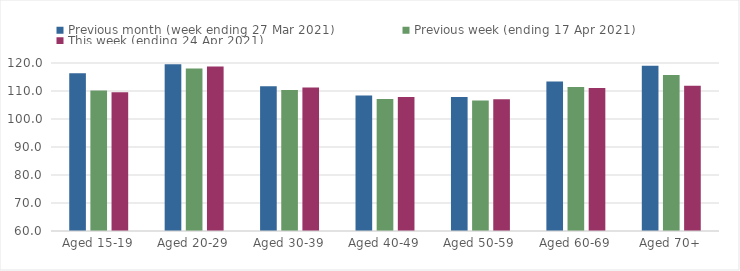
| Category | Previous month (week ending 27 Mar 2021) | Previous week (ending 17 Apr 2021) | This week (ending 24 Apr 2021) |
|---|---|---|---|
| Aged 15-19 | 116.3 | 110.18 | 109.53 |
| Aged 20-29 | 119.55 | 118.02 | 118.79 |
| Aged 30-39 | 111.74 | 110.39 | 111.22 |
| Aged 40-49 | 108.36 | 107.14 | 107.82 |
| Aged 50-59 | 107.86 | 106.6 | 107.01 |
| Aged 60-69 | 113.43 | 111.47 | 111.05 |
| Aged 70+ | 119.06 | 115.71 | 111.87 |